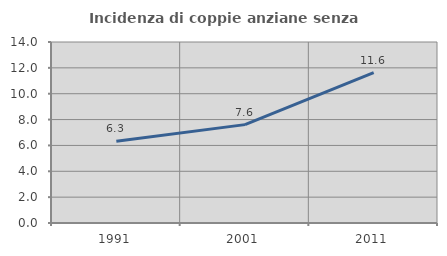
| Category | Incidenza di coppie anziane senza figli  |
|---|---|
| 1991.0 | 6.316 |
| 2001.0 | 7.609 |
| 2011.0 | 11.628 |